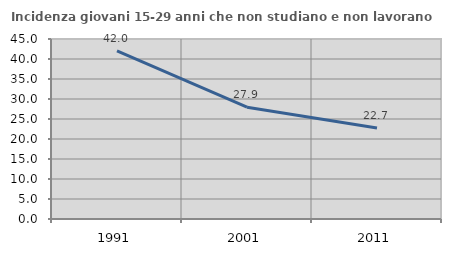
| Category | Incidenza giovani 15-29 anni che non studiano e non lavorano  |
|---|---|
| 1991.0 | 42.04 |
| 2001.0 | 27.946 |
| 2011.0 | 22.727 |